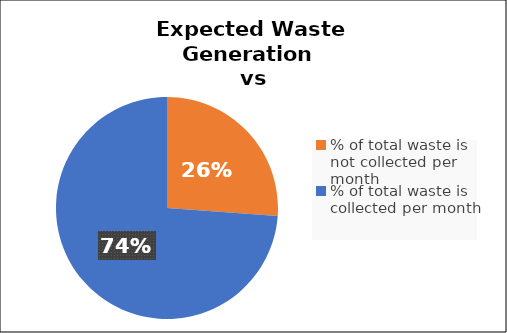
| Category | Series 0 |
|---|---|
| % of total waste is not collected per month | 0.262 |
| % of total waste is collected per month | 0.738 |